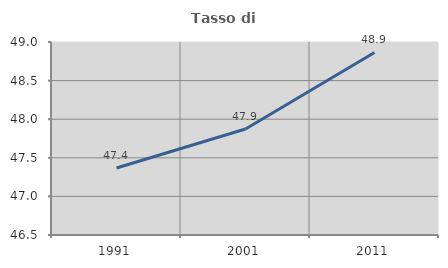
| Category | Tasso di occupazione   |
|---|---|
| 1991.0 | 47.368 |
| 2001.0 | 47.873 |
| 2011.0 | 48.865 |